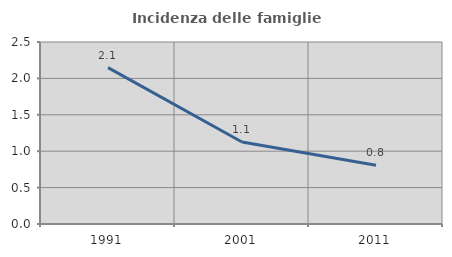
| Category | Incidenza delle famiglie numerose |
|---|---|
| 1991.0 | 2.149 |
| 2001.0 | 1.126 |
| 2011.0 | 0.807 |